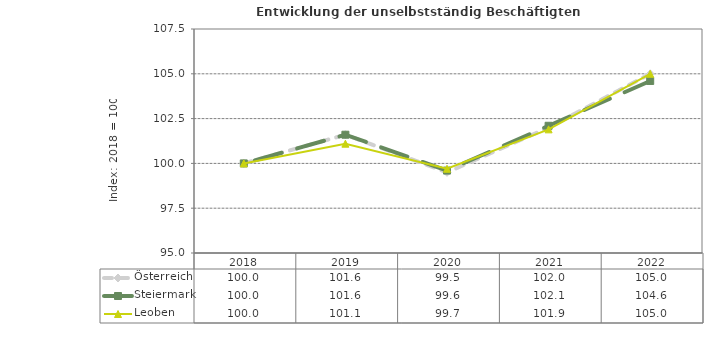
| Category | Österreich | Steiermark | Leoben |
|---|---|---|---|
| 2022.0 | 105 | 104.6 | 105 |
| 2021.0 | 102 | 102.1 | 101.9 |
| 2020.0 | 99.5 | 99.6 | 99.7 |
| 2019.0 | 101.6 | 101.6 | 101.1 |
| 2018.0 | 100 | 100 | 100 |